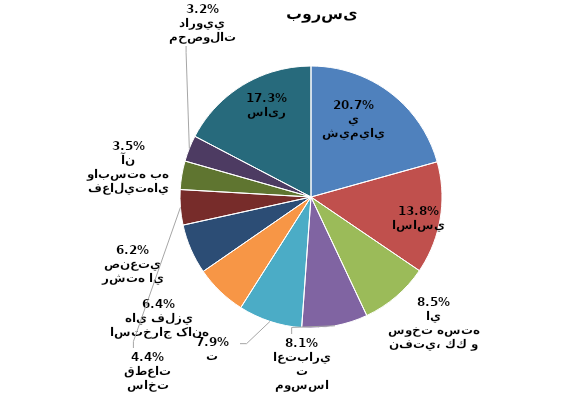
| Category | Series 0 |
|---|---|
| محصولات شيميايي | 0.207 |
| فلزات اساسي | 0.138 |
| فراورده هاي نفتي، كك و سوخت هسته اي | 0.085 |
| بانكها و موسسات اعتباري | 0.081 |
| مخابرات | 0.079 |
| استخراج کانه هاي فلزي | 0.064 |
| شرکتهاي چند رشته اي صنعتي | 0.062 |
| خودرو و ساخت قطعات | 0.043 |
| رايانه و فعاليت‌هاي وابسته به آن | 0.035 |
| مواد و محصولات دارويي | 0.032 |
| سایر | 0.173 |